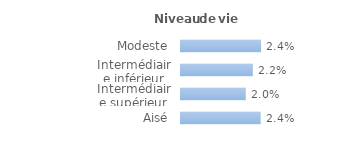
| Category | Series 0 |
|---|---|
| Modeste | 0.024 |
| Intermédiaire inférieur | 0.022 |
| Intermédiaire supérieur | 0.02 |
| Aisé | 0.024 |